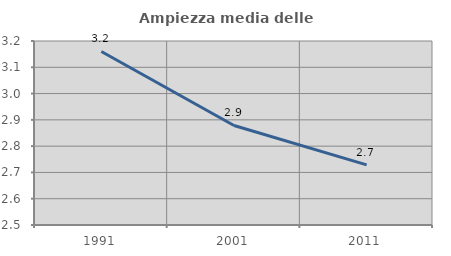
| Category | Ampiezza media delle famiglie |
|---|---|
| 1991.0 | 3.16 |
| 2001.0 | 2.879 |
| 2011.0 | 2.729 |